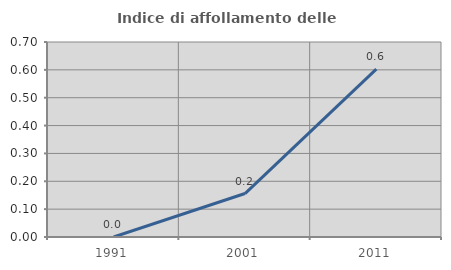
| Category | Indice di affollamento delle abitazioni  |
|---|---|
| 1991.0 | 0 |
| 2001.0 | 0.156 |
| 2011.0 | 0.602 |